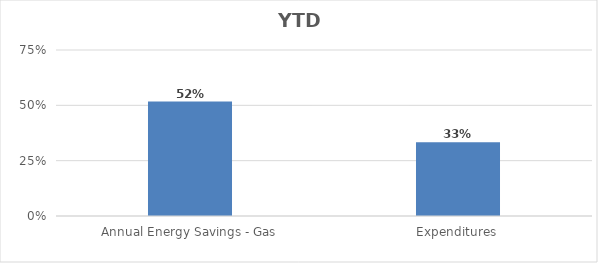
| Category | Series 0 |
|---|---|
| Annual Energy Savings - Gas | 0.517 |
| Expenditures | 0.333 |